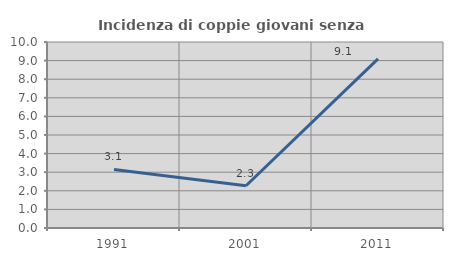
| Category | Incidenza di coppie giovani senza figli |
|---|---|
| 1991.0 | 3.15 |
| 2001.0 | 2.273 |
| 2011.0 | 9.091 |